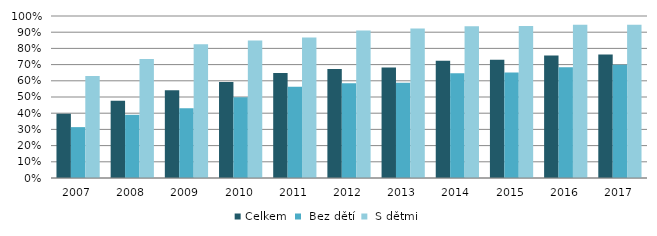
| Category | Celkem |  Bez dětí |  S dětmi |
|---|---|---|---|
| 2007.0 | 0.396 | 0.314 | 0.63 |
| 2008.0 | 0.477 | 0.39 | 0.735 |
| 2009.0 | 0.542 | 0.431 | 0.825 |
| 2010.0 | 0.593 | 0.499 | 0.848 |
| 2011.0 | 0.648 | 0.563 | 0.868 |
| 2012.0 | 0.673 | 0.585 | 0.911 |
| 2013.0 | 0.681 | 0.588 | 0.923 |
| 2014.0 | 0.724 | 0.647 | 0.937 |
| 2015.0 | 0.731 | 0.651 | 0.938 |
| 2016.0 | 0.756 | 0.684 | 0.946 |
| 2017.0 | 0.763 | 0.699 | 0.946 |